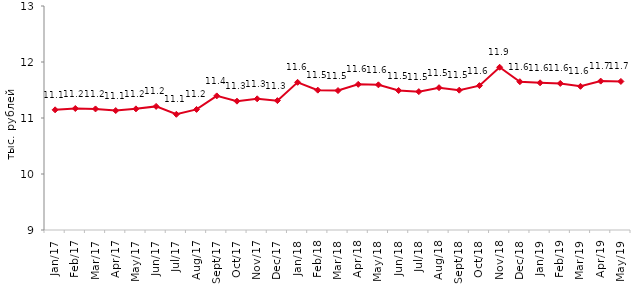
| Category | тыс. руб. |
|---|---|
| 2017-01-01 | 11.146 |
| 2017-02-01 | 11.17 |
| 2017-03-01 | 11.162 |
| 2017-04-01 | 11.133 |
| 2017-05-01 | 11.163 |
| 2017-06-01 | 11.207 |
| 2017-07-01 | 11.066 |
| 2017-08-01 | 11.153 |
| 2017-09-01 | 11.395 |
| 2017-10-01 | 11.301 |
| 2017-11-01 | 11.342 |
| 2017-12-01 | 11.31 |
| 2018-01-01 | 11.637 |
| 2018-02-01 | 11.497 |
| 2018-03-01 | 11.49 |
| 2018-04-01 | 11.601 |
| 2018-05-01 | 11.592 |
| 2018-06-01 | 11.491 |
| 2018-07-01 | 11.471 |
| 2018-08-01 | 11.541 |
| 2018-09-01 | 11.497 |
| 2018-10-01 | 11.578 |
| 2018-11-01 | 11.906 |
| 2018-12-01 | 11.648 |
| 2019-01-01 | 11.629 |
| 2019-02-01 | 11.617 |
| 2019-03-01 | 11.566 |
| 2019-04-01 | 11.659 |
| 2019-05-01 | 11.653 |